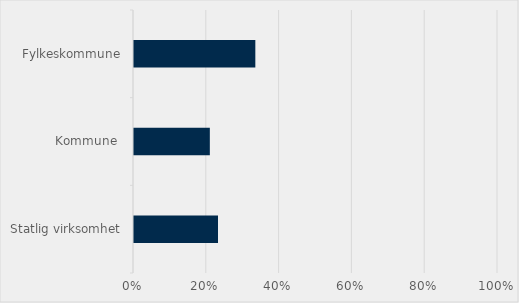
| Category | Series 0 |
|---|---|
| Statlig virksomhet | 0.231 |
| Kommune  | 0.208 |
| Fylkeskommune | 0.333 |